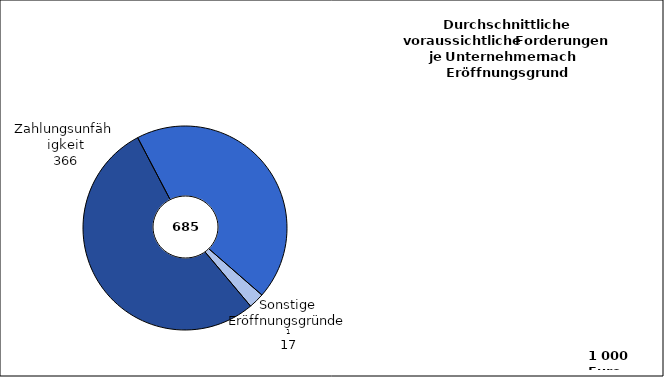
| Category | Series 0 | Series 1 |
|---|---|---|
| Zahlungsunfähigkeit | 366 | 994 |
|   Zahlungsunfähigkeit
   und Überschuldung | 302 | 977 |
|   Sonstige Eröffnungs-
                      gründe  2 | 17 | 193 |